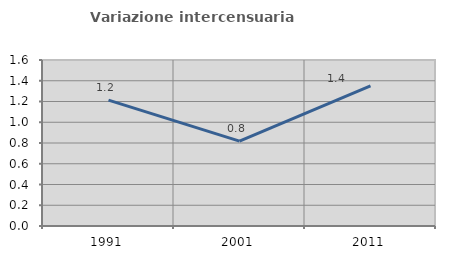
| Category | Variazione intercensuaria annua |
|---|---|
| 1991.0 | 1.213 |
| 2001.0 | 0.818 |
| 2011.0 | 1.351 |